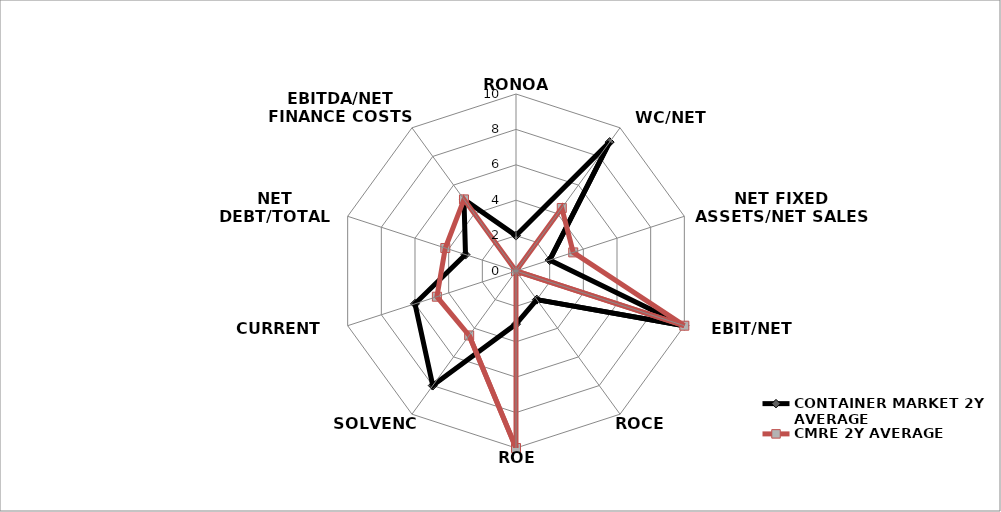
| Category | CONTAINER MARKET 2Y AVERAGE | CMRE 2Y AVERAGE |
|---|---|---|
| RONOA | 2 | 0 |
| WC/NET SALES | 9 | 4.4 |
| NET FIXED ASSETS/NET SALES | 2 | 3.4 |
| EBIT/NET SALES | 10 | 10 |
| ROCE | 2 | 0 |
| ROE | 3 | 10 |
| SOLVENCY | 8 | 4.5 |
| CURRENT RATIO | 6 | 4.7 |
| NET DEBT/TOTAL ASSETS | 3 | 4.2 |
| EBITDA/NET FINANCE COSTS | 5 | 5 |